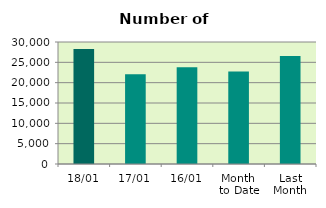
| Category | Series 0 |
|---|---|
| 18/01 | 28280 |
| 17/01 | 22044 |
| 16/01 | 23802 |
| Month 
to Date | 22773.231 |
| Last
Month | 26558.947 |